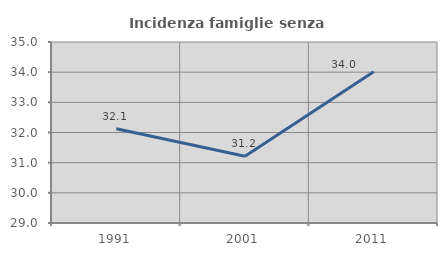
| Category | Incidenza famiglie senza nuclei |
|---|---|
| 1991.0 | 32.122 |
| 2001.0 | 31.21 |
| 2011.0 | 34.015 |